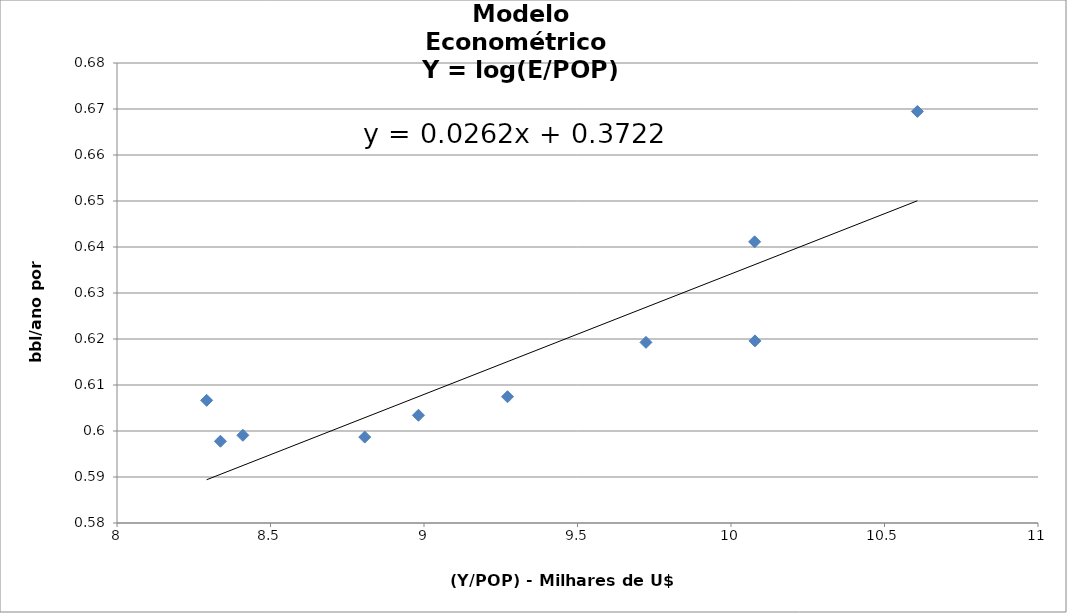
| Category | Y = log(E/POP) |
|---|---|
| 8.337 | 0.598 |
| 8.292 | 0.607 |
| 8.41 | 0.599 |
| 8.419 | 0.577 |
| 8.807 | 0.599 |
| 8.982 | 0.603 |
| 9.272 | 0.607 |
| 9.723 | 0.619 |
| 10.077 | 0.641 |
| 10.078 | 0.62 |
| 10.607000000000001 | 0.669 |